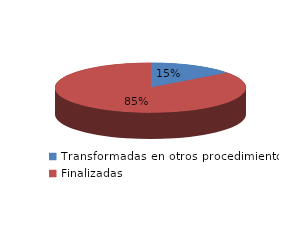
| Category | Series 0 |
|---|---|
| Transformadas en otros procedimientos | 2109 |
| Finalizadas | 12307 |